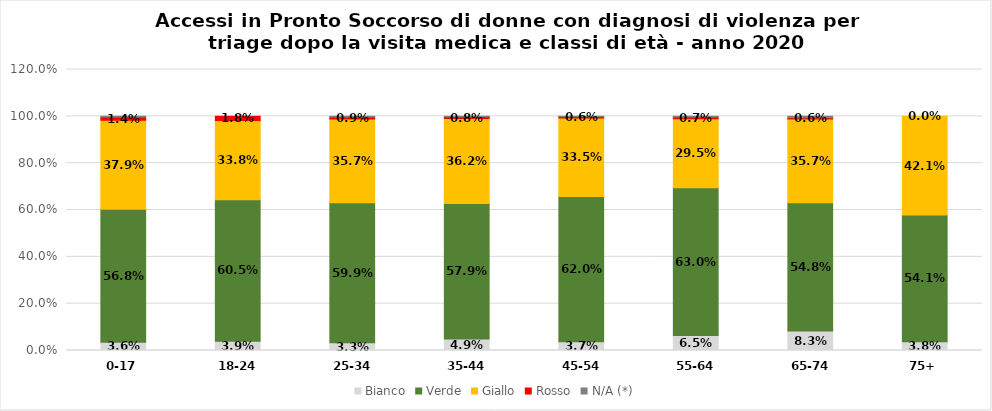
| Category | Bianco | Verde | Giallo | Rosso | N/A (*) |
|---|---|---|---|---|---|
| 0-17 | 0.036 | 0.568 | 0.379 | 0.014 | 0.003 |
| 18-24 | 0.039 | 0.605 | 0.338 | 0.018 | 0 |
| 25-34 | 0.033 | 0.599 | 0.357 | 0.009 | 0.003 |
| 35-44 | 0.049 | 0.579 | 0.362 | 0.008 | 0.002 |
| 45-54 | 0.037 | 0.62 | 0.335 | 0.006 | 0.001 |
| 55-64 | 0.065 | 0.63 | 0.295 | 0.007 | 0.002 |
| 65-74 | 0.083 | 0.548 | 0.357 | 0.006 | 0.006 |
| 75+ | 0.038 | 0.541 | 0.421 | 0 | 0 |